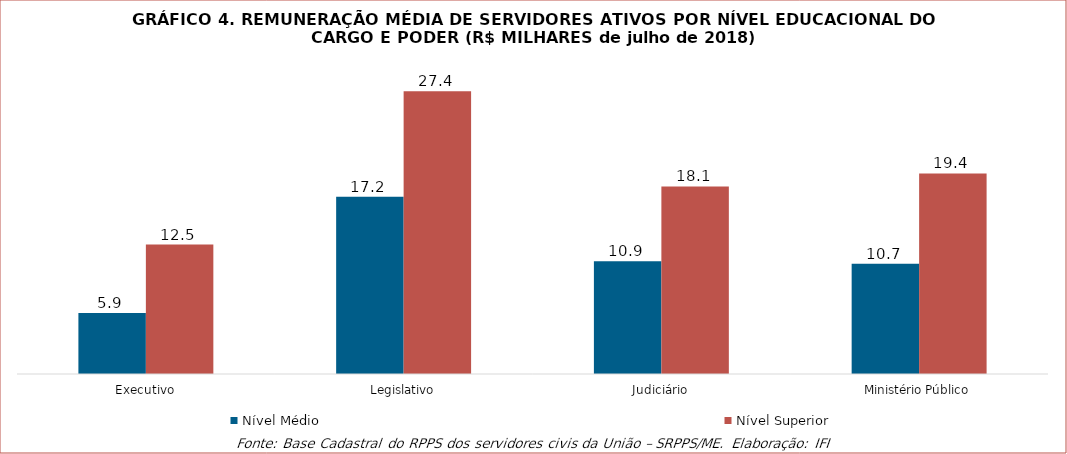
| Category | Nível Médio | Nível Superior |
|---|---|---|
| Executivo | 5891.743 | 12530.005 |
| Legislativo | 17159.382 | 27358.833 |
| Judiciário | 10910.976 | 18148.49 |
| Ministério Público | 10679.531 | 19410.139 |